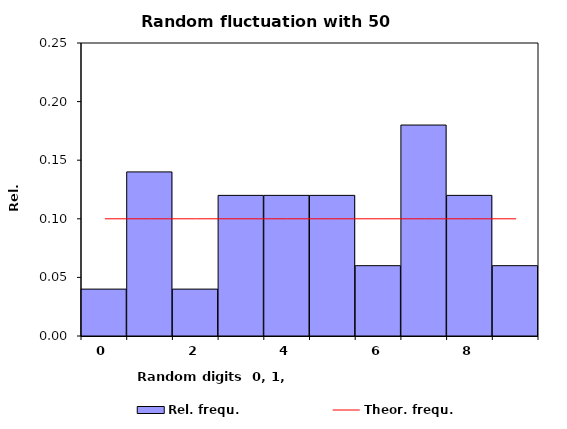
| Category | Rel. frequ. |
|---|---|
| 0.0 | 0.04 |
| 1.0 | 0.14 |
| 2.0 | 0.04 |
| 3.0 | 0.12 |
| 4.0 | 0.12 |
| 5.0 | 0.12 |
| 6.0 | 0.06 |
| 7.0 | 0.18 |
| 8.0 | 0.12 |
| 9.0 | 0.06 |